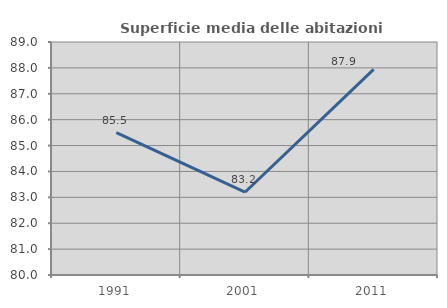
| Category | Superficie media delle abitazioni occupate |
|---|---|
| 1991.0 | 85.5 |
| 2001.0 | 83.197 |
| 2011.0 | 87.944 |